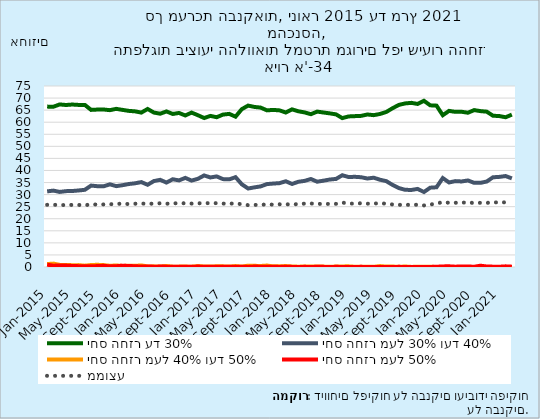
| Category | יחס החזר עד 30% | יחס החזר מעל 30% ועד 40% | יחס החזר מעל 40% ועד 50% | יחס החזר מעל 50% | ממוצע |
|---|---|---|---|---|---|
| 2011-04-01 | 51.753 | 24.674 | 11.658 | 11.914 | 32.385 |
| 2011-05-01 | 50.828 | 23.759 | 12.081 | 13.333 | 33.19 |
| 2011-06-01 | 50.905 | 25.903 | 11.04 | 12.152 | 32.576 |
| 2011-07-01 | 50.892 | 25 | 12.107 | 12 | 32.58 |
| 2011-08-01 | 51.557 | 24.591 | 12.594 | 11.258 | 32.261 |
| 2011-09-01 | 49.402 | 25.058 | 13.291 | 12.248 | 33.019 |
| 2011-10-01 | 50.318 | 25.317 | 12.75 | 11.614 | 32.361 |
| 2011-11-01 | 49.551 | 24.346 | 13.09 | 13.013 | 33.303 |
| 2011-12-01 | 52.956 | 24.514 | 11.428 | 11.102 | 31.988 |
| 2012-01-01 | 52.827 | 25.476 | 11.85 | 9.847 | 31.729 |
| 2012-02-01 | 50.284 | 24.283 | 14.025 | 11.409 | 32.795 |
| 2012-03-01 | 53.479 | 25.085 | 12.081 | 9.355 | 31.345 |
| 2012-04-01 | 55.058 | 23.907 | 12.402 | 8.634 | 30.759 |
| 2012-05-01 | 52.496 | 25.157 | 12.243 | 10.104 | 32.082 |
| 2012-06-01 | 55.324 | 23.7 | 11.301 | 9.675 | 31.106 |
| 2012-07-01 | 55.729 | 24.216 | 11.286 | 8.769 | 30.871 |
| 2012-08-01 | 54.636 | 24.904 | 11.14 | 9.321 | 31.158 |
| 2012-09-01 | 56.519 | 23.142 | 11.25 | 9.089 | 31.044 |
| 2012-10-01 | 55.528 | 25.299 | 11.146 | 8.028 | 30.575 |
| 2012-11-01 | 55.325 | 25.848 | 10.973 | 7.854 | 30.632 |
| 2012-12-01 | 57.451 | 24.812 | 10.594 | 7.143 | 30.162 |
| 2013-01-01 | 59.502 | 24.221 | 9.344 | 6.933 | 29.541 |
| 2013-02-01 | 59.127 | 24.69 | 10.242 | 5.941 | 29.573 |
| 2013-03-01 | 59.532 | 23.256 | 10.466 | 6.746 | 29.681 |
| 2013-04-01 | 57.95 | 25.033 | 10.003 | 7.014 | 29.951 |
| 2013-05-01 | 58.983 | 24.199 | 10.03 | 6.787 | 29.697 |
| 2013-06-01 | 58.436 | 24.156 | 10.513 | 6.894 | 29.807 |
| 2013-07-01 | 59.961 | 24.057 | 9.574 | 6.409 | 29.503 |
| 2013-08-01 | 59.016 | 24.104 | 10.448 | 6.432 | 29.75 |
| 2013-09-01 | 58.191 | 27.579 | 8.775 | 5.455 | 29.402 |
| 2013-10-01 | 58.855 | 28.622 | 8.344 | 4.179 | 29.094 |
| 2013-11-01 | 62.274 | 28.415 | 6.311 | 2.999 | 27.769 |
| 2013-12-01 | 62.677 | 29.851 | 5.429 | 2.043 | 27.365 |
| 2014-01-01 | 63.798 | 29.003 | 5.661 | 1.537 | 27.201 |
| 2014-02-01 | 61.333 | 32.515 | 4.667 | 1.485 | 27.333 |
| 2014-03-01 | 64.136 | 31.005 | 3.373 | 1.486 | 26.99 |
| 2014-04-01 | 64.172 | 31.615 | 2.863 | 1.35 | 26.806 |
| 2014-05-01 | 63.655 | 31.508 | 3.483 | 1.354 | 26.994 |
| 2014-06-01 | 63.47 | 32.072 | 3.205 | 1.254 | 26.83 |
| 2014-07-01 | 63.12 | 32.99 | 2.78 | 1.109 | 26.953 |
| 2014-08-01 | 62.11 | 34.472 | 2.393 | 1.025 | 26.998 |
| 2014-09-01 | 63.047 | 32.711 | 2.968 | 1.274 | 26.832 |
| 2014-10-01 | 65.48 | 30.834 | 2.444 | 1.242 | 26.302 |
| 2014-11-01 | 65.549 | 31.332 | 1.936 | 1.182 | 26.159 |
| 2014-12-01 | 63.425 | 33.801 | 1.951 | 0.822 | 26.368 |
| 2015-01-01 | 66.462 | 31.344 | 1.226 | 0.969 | 25.773 |
| 2015-02-01 | 66.404 | 31.649 | 1.4 | 0.547 | 25.785 |
| 2015-03-01 | 67.369 | 31.106 | 0.878 | 0.647 | 25.673 |
| 2015-04-01 | 67.126 | 31.435 | 0.842 | 0.597 | 25.669 |
| 2015-05-01 | 67.32 | 31.487 | 0.758 | 0.435 | 25.734 |
| 2015-06-01 | 67.159 | 31.711 | 0.779 | 0.35 | 25.719 |
| 2015-07-01 | 67.174 | 31.987 | 0.552 | 0.287 | 25.538 |
| 2015-08-01 | 65.099 | 33.74 | 0.834 | 0.327 | 26.037 |
| 2015-09-01 | 65.235 | 33.482 | 0.908 | 0.375 | 25.843 |
| 2015-10-01 | 65.258 | 33.453 | 0.784 | 0.505 | 25.93 |
| 2015-11-01 | 64.99 | 34.247 | 0.509 | 0.254 | 26.026 |
| 2015-12-01 | 65.535 | 33.503 | 0.641 | 0.321 | 26.078 |
| 2016-01-01 | 65.104 | 33.895 | 0.446 | 0.555 | 26.301 |
| 2016-02-01 | 64.696 | 34.386 | 0.512 | 0.406 | 26.059 |
| 2016-03-01 | 64.493 | 34.689 | 0.487 | 0.332 | 26.224 |
| 2016-04-01 | 63.984 | 35.184 | 0.659 | 0.174 | 26.337 |
| 2016-05-01 | 65.474 | 34.076 | 0.24 | 0.21 | 26.134 |
| 2016-06-01 | 63.988 | 35.611 | 0.263 | 0.139 | 26.303 |
| 2016-07-01 | 63.52 | 36.12 | 0.196 | 0.164 | 26.404 |
| 2016-08-01 | 64.459 | 34.987 | 0.402 | 0.153 | 26.212 |
| 2016-09-01 | 63.416 | 36.354 | 0.146 | 0.083 | 26.395 |
| 2016-10-01 | 63.83 | 35.89 | 0.155 | 0.125 | 26.402 |
| 2016-11-01 | 62.796 | 36.919 | 0.166 | 0.12 | 26.424 |
| 2016-12-01 | 63.976 | 35.804 | 0.133 | 0.087 | 26.276 |
| 2017-01-01 | 62.906 | 36.539 | 0.375 | 0.18 | 26.362 |
| 2017-02-01 | 61.732 | 37.936 | 0.221 | 0.111 | 26.532 |
| 2017-03-01 | 62.605 | 37.106 | 0.174 | 0.115 | 26.394 |
| 2017-04-01 | 62.063 | 37.537 | 0.297 | 0.102 | 26.462 |
| 2017-05-01 | 63.159 | 36.416 | 0.268 | 0.156 | 26.277 |
| 2017-06-01 | 63.445 | 36.32 | 0.176 | 0.059 | 26.194 |
| 2017-07-01 | 62.292 | 37.222 | 0.381 | 0.104 | 26.416 |
| 2017-08-01 | 65.41 | 34.273 | 0.167 | 0.15 | 25.987 |
| 2017-09-01 | 66.88 | 32.522 | 0.558 | 0.039 | 25.629 |
| 2017-10-01 | 66.325 | 32.998 | 0.489 | 0.188 | 25.733 |
| 2017-11-01 | 66.049 | 33.4 | 0.42 | 0.131 | 25.712 |
| 2017-12-01 | 64.91 | 34.358 | 0.606 | 0.126 | 25.99 |
| 2018-01-01 | 65.096 | 34.576 | 0.258 | 0.071 | 25.821 |
| 2018-02-01 | 64.897 | 34.751 | 0.305 | 0.047 | 25.997 |
| 2018-03-01 | 64.021 | 35.519 | 0.382 | 0.078 | 26.001 |
| 2018-04-01 | 65.315 | 34.411 | 0.225 | 0.049 | 25.894 |
| 2018-05-01 | 64.524 | 35.32 | 0.136 | 0.021 | 26.099 |
| 2018-06-01 | 64.051 | 35.683 | 0.208 | 0.058 | 26.265 |
| 2018-07-01 | 63.319 | 36.466 | 0.188 | 0.027 | 26.294 |
| 2018-08-01 | 64.393 | 35.349 | 0.187 | 0.071 | 26.199 |
| 2018-09-01 | 64.013 | 35.764 | 0.171 | 0.052 | 26.09 |
| 2018-10-01 | 63.663 | 36.248 | 0.069 | 0.02 | 26.154 |
| 2018-11-01 | 63.242 | 36.493 | 0.204 | 0.061 | 26.17 |
| 2018-12-01 | 61.697 | 38.019 | 0.248 | 0.036 | 26.67 |
| 2019-01-01 | 62.39 | 37.286 | 0.274 | 0.051 | 26.342 |
| 2019-02-01 | 62.512 | 37.37 | 0.11 | 0.008 | 26.21 |
| 2019-03-01 | 62.624 | 37.201 | 0.113 | 0.062 | 26.425 |
| 2019-04-01 | 63.195 | 36.667 | 0.134 | 0.004 | 26.241 |
| 2019-05-01 | 62.921 | 37.001 | 0.075 | 0.003 | 26.303 |
| 2019-06-01 | 63.41 | 36.157 | 0.381 | 0.051 | 26.403 |
| 2019-07-01 | 64.237 | 35.586 | 0.173 | 0.003 | 26.228 |
| 2019-08-01 | 65.779 | 34.01 | 0.196 | 0.015 | 25.914 |
| 2019-09-01 | 67.165 | 32.711 | 0.067 | 0.057 | 25.723 |
| 2019-10-01 | 67.778 | 31.985 | 0.209 | 0.028 | 25.855 |
| 2019-11-01 | 68.018 | 31.927 | 0.044 | 0.011 | 25.668 |
| 2019-12-01 | 67.552 | 32.355 | 0.076 | 0.016 | 25.821 |
| 2020-01-01 | 68.874 | 31.065 | 0.051 | 0.01 | 25.509 |
| 2020-02-01 | 66.99 | 32.868 | 0.114 | 0.028 | 25.893 |
| 2020-03-01 | 66.866 | 33.037 | 0 | 0.097 | 26.28 |
| 2020-04-01 | 62.897 | 36.854 | 0 | 0.248 | 26.911 |
| 2020-05-01 | 64.687 | 35.029 | 0 | 0.284 | 26.593 |
| 2020-06-01 | 64.282 | 35.583 | 0 | 0.135 | 26.617 |
| 2020-07-01 | 64.323 | 35.446 | 0 | 0.231 | 26.68 |
| 2020-08-01 | 63.92 | 35.863 | 0 | 0.217 | 26.731 |
| 2020-09-01 | 65.013 | 34.877 | 0 | 0.11 | 26.508 |
| 2020-10-01 | 64.594 | 34.871 | 0 | 0.535 | 26.586 |
| 2020-11-01 | 64.365 | 35.42 | 0 | 0.215 | 26.556 |
| 2020-12-01 | 62.672 | 37.182 | 0 | 0.146 | 26.819 |
| 2021-01-01 | 62.55 | 37.338 | 0 | 0.112 | 26.724 |
| 2021-02-01 | 62.046 | 37.686 | 0 | 0.268 | 26.808 |
| 2021-03-01 | 63.137 | 36.721 | 0 | 0.141 | 26.713 |